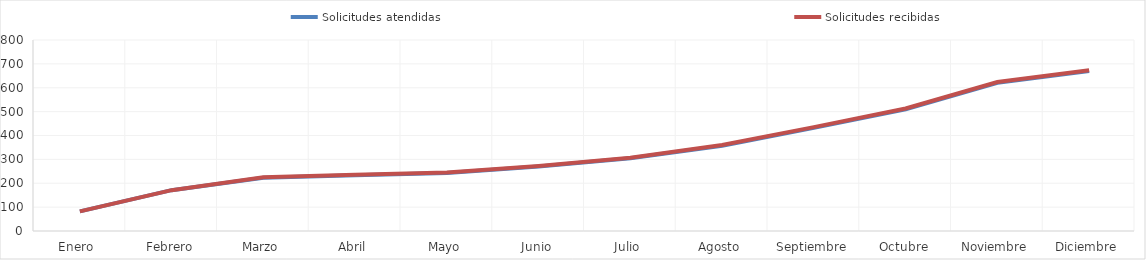
| Category | Solicitudes atendidas | Solicitudes recibidas  |
|---|---|---|
| Enero  | 82 | 82 |
| Febrero | 171 | 171 |
| Marzo | 223 | 225 |
| Abril | 234 | 236 |
| Mayo | 243 | 245 |
| Junio | 270 | 272 |
| Julio | 305 | 307 |
| Agosto | 357 | 360 |
| Septiembre | 432 | 435 |
| Octubre | 510 | 513 |
| Noviembre | 621 | 624 |
| Diciembre | 670 | 673 |